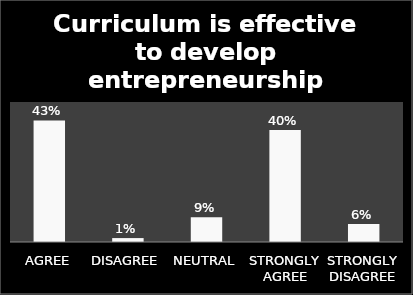
| Category | Series 0 |
|---|---|
| AGREE | 0.434 |
| DISAGREE | 0.014 |
| NEUTRAL | 0.088 |
| STRONGLY AGREE | 0.4 |
| STRONGLY DISAGREE | 0.064 |